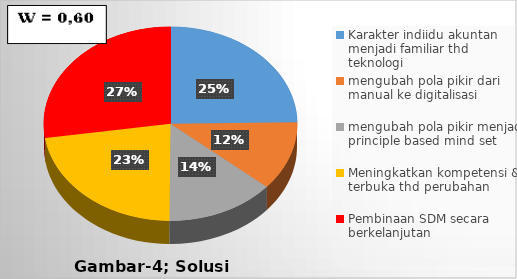
| Category | SOLUSI INTERN |
|---|---|
| Karakter indiidu akuntan menjadi familiar thd teknologi | 0.248 |
| mengubah pola pikir dari manual ke digitalisasi | 0.115 |
| mengubah pola pikir menjadi principle based mind set | 0.138 |
| Meningkatkan kompetensi & terbuka thd perubahan | 0.225 |
| Pembinaan SDM secara berkelanjutan | 0.274 |